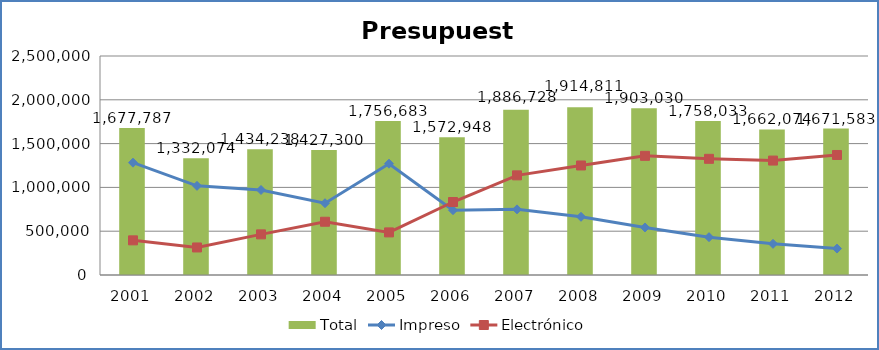
| Category | Total |
|---|---|
| 2001 | 1677787 |
| 2002 | 1332074 |
| 2003 | 1434238 |
| 2004 | 1427300 |
| 2005 | 1756683 |
| 2006 | 1572948 |
| 2007 | 1886727.83 |
| 2008 | 1914811 |
| 2009 | 1903030 |
| 2010 | 1758033.4 |
| 2011 | 1662074 |
| 2012 | 1671583 |